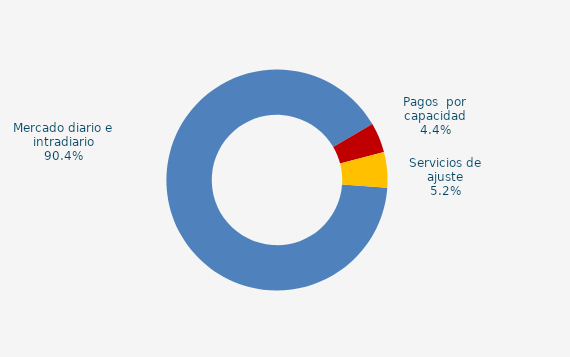
| Category | Series 0 |
|---|---|
| Mercado diario e intradiario | 63.67 |
| Pagos  por capacidad | 3.08 |
| Servicio interrumpibilidad | 0 |
| Servicios de ajuste | 3.65 |